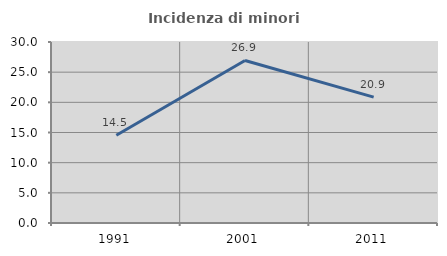
| Category | Incidenza di minori stranieri |
|---|---|
| 1991.0 | 14.545 |
| 2001.0 | 26.943 |
| 2011.0 | 20.866 |